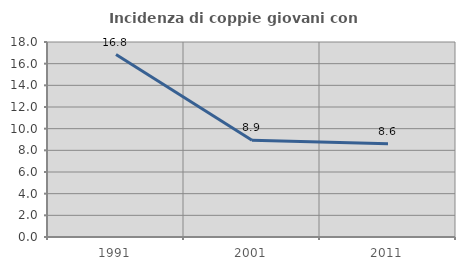
| Category | Incidenza di coppie giovani con figli |
|---|---|
| 1991.0 | 16.842 |
| 2001.0 | 8.939 |
| 2011.0 | 8.609 |